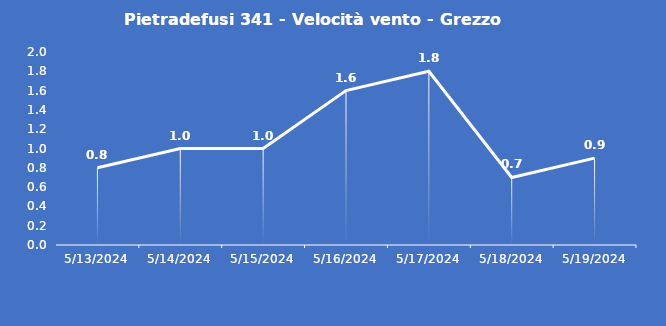
| Category | Pietradefusi 341 - Velocità vento - Grezzo (m/s) |
|---|---|
| 5/13/24 | 0.8 |
| 5/14/24 | 1 |
| 5/15/24 | 1 |
| 5/16/24 | 1.6 |
| 5/17/24 | 1.8 |
| 5/18/24 | 0.7 |
| 5/19/24 | 0.9 |